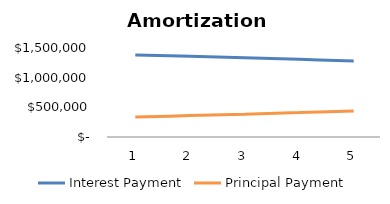
| Category | Interest Payment | Principal Payment |
|---|---|---|
| 0 | 1382777.651 | 337347.349 |
| 1 | 1359622.446 | 360502.554 |
| 2 | 1334877.888 | 385247.112 |
| 3 | 1308434.888 | 411690.112 |
| 4 | 1280176.864 | 439948.136 |